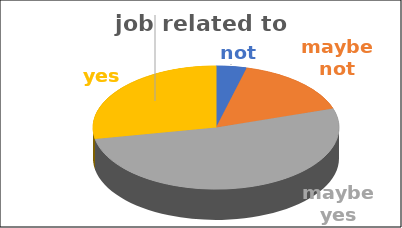
| Category | job related to studies | Series 1 | Series 2 | Series 3 | Series 4 |
|---|---|---|---|---|---|
| not | 0.04 |  |  |  |  |
| maybe not | 0.16 |  |  |  |  |
| maybe yes | 0.52 |  |  |  |  |
| yes | 0.28 |  |  |  |  |